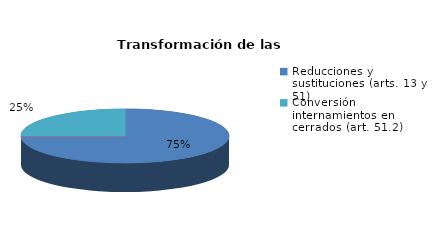
| Category | Series 0 |
|---|---|
| Reducciones y sustituciones (arts. 13 y 51) | 3 |
| Por quebrantamiento (art. 50.2) | 0 |
| Cancelaciones anticipadas | 0 |
| Traslado a Centros Penitenciarios | 0 |
| Conversión internamientos en cerrados (art. 51.2) | 1 |